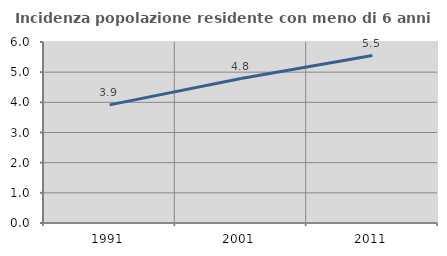
| Category | Incidenza popolazione residente con meno di 6 anni |
|---|---|
| 1991.0 | 3.916 |
| 2001.0 | 4.79 |
| 2011.0 | 5.55 |